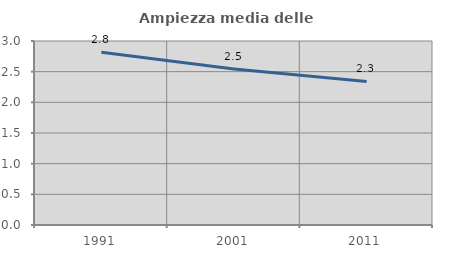
| Category | Ampiezza media delle famiglie |
|---|---|
| 1991.0 | 2.818 |
| 2001.0 | 2.542 |
| 2011.0 | 2.341 |